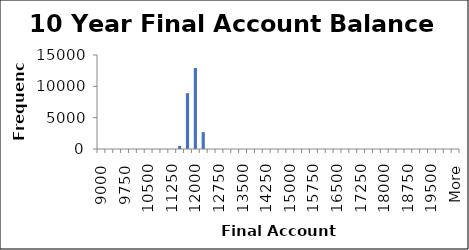
| Category | Frequency |
|---|---|
| 9000.0 | 0 |
| 9250.0 | 0 |
| 9500.0 | 0 |
| 9750.0 | 0 |
| 10000.0 | 0 |
| 10250.0 | 0 |
| 10500.0 | 0 |
| 10750.0 | 0 |
| 11000.0 | 0 |
| 11250.0 | 0 |
| 11500.0 | 471 |
| 11750.0 | 8906 |
| 12000.0 | 12928 |
| 12250.0 | 2694 |
| 12500.0 | 1 |
| 12750.0 | 0 |
| 13000.0 | 0 |
| 13250.0 | 0 |
| 13500.0 | 0 |
| 13750.0 | 0 |
| 14000.0 | 0 |
| 14250.0 | 0 |
| 14500.0 | 0 |
| 14750.0 | 0 |
| 15000.0 | 0 |
| 15250.0 | 0 |
| 15500.0 | 0 |
| 15750.0 | 0 |
| 16000.0 | 0 |
| 16250.0 | 0 |
| 16500.0 | 0 |
| 16750.0 | 0 |
| 17000.0 | 0 |
| 17250.0 | 0 |
| 17500.0 | 0 |
| 17750.0 | 0 |
| 18000.0 | 0 |
| 18250.0 | 0 |
| 18500.0 | 0 |
| 18750.0 | 0 |
| 19000.0 | 0 |
| 19250.0 | 0 |
| 19500.0 | 0 |
| 19750.0 | 0 |
| 20000.0 | 0 |
| More | 0 |